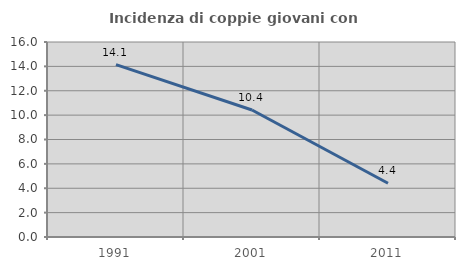
| Category | Incidenza di coppie giovani con figli |
|---|---|
| 1991.0 | 14.146 |
| 2001.0 | 10.423 |
| 2011.0 | 4.412 |